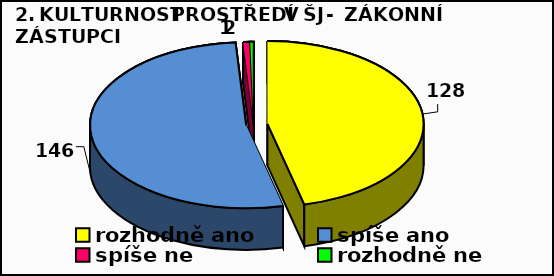
| Category | Series 0 |
|---|---|
| rozhodně ano | 128 |
| spíše ano | 146 |
| spíše ne | 2 |
| rozhodně ne | 1 |